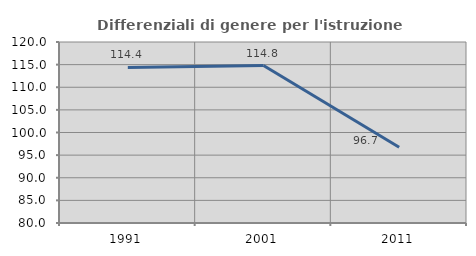
| Category | Differenziali di genere per l'istruzione superiore |
|---|---|
| 1991.0 | 114.381 |
| 2001.0 | 114.803 |
| 2011.0 | 96.745 |